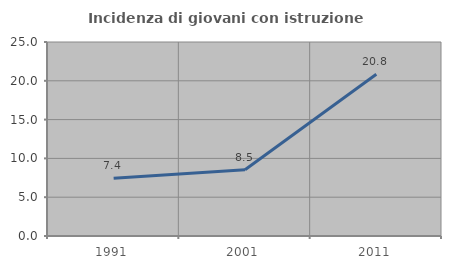
| Category | Incidenza di giovani con istruzione universitaria |
|---|---|
| 1991.0 | 7.447 |
| 2001.0 | 8.527 |
| 2011.0 | 20.833 |